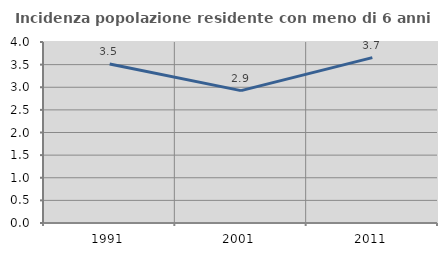
| Category | Incidenza popolazione residente con meno di 6 anni |
|---|---|
| 1991.0 | 3.514 |
| 2001.0 | 2.925 |
| 2011.0 | 3.655 |